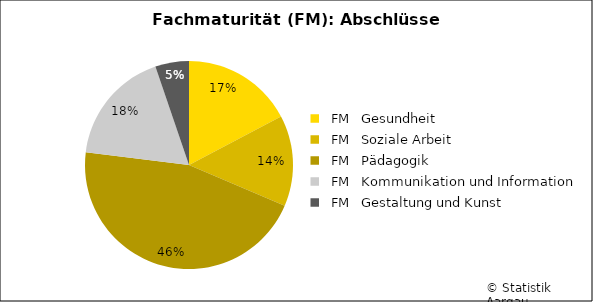
| Category | Series 0 |
|---|---|
|   FM   Gesundheit | 33 |
|   FM   Soziale Arbeit | 27 |
|   FM   Pädagogik | 87 |
|   FM   Kommunikation und Information | 34 |
|   FM   Gestaltung und Kunst | 10 |